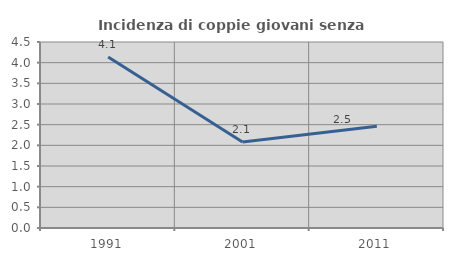
| Category | Incidenza di coppie giovani senza figli |
|---|---|
| 1991.0 | 4.135 |
| 2001.0 | 2.078 |
| 2011.0 | 2.462 |